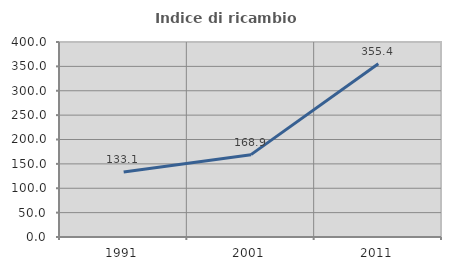
| Category | Indice di ricambio occupazionale  |
|---|---|
| 1991.0 | 133.115 |
| 2001.0 | 168.915 |
| 2011.0 | 355.435 |